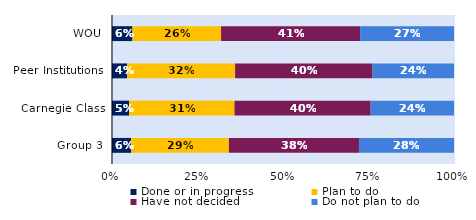
| Category | Done or in progress | Plan to do | Have not decided | Do not plan to do |
|---|---|---|---|---|
| WOU | 0.06 | 0.259 | 0.406 | 0.275 |
| Peer Institutions | 0.044 | 0.316 | 0.402 | 0.238 |
| Carnegie Class | 0.05 | 0.308 | 0.398 | 0.244 |
| Group 3 | 0.056 | 0.286 | 0.38 | 0.278 |